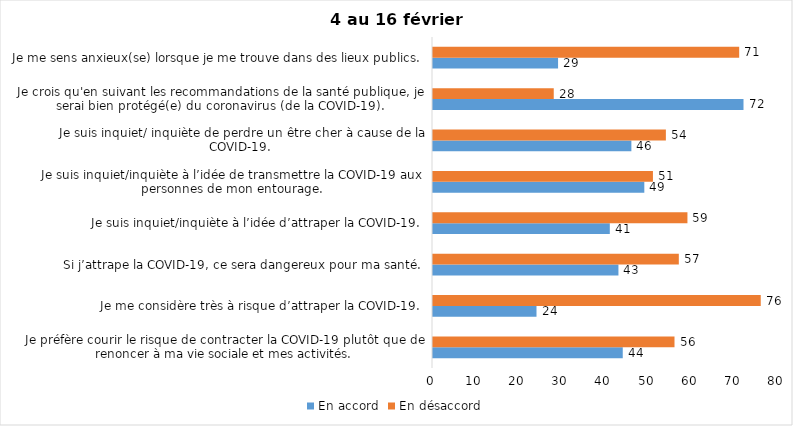
| Category | En accord | En désaccord |
|---|---|---|
| Je préfère courir le risque de contracter la COVID-19 plutôt que de renoncer à ma vie sociale et mes activités. | 44 | 56 |
| Je me considère très à risque d’attraper la COVID-19. | 24 | 76 |
| Si j’attrape la COVID-19, ce sera dangereux pour ma santé. | 43 | 57 |
| Je suis inquiet/inquiète à l’idée d’attraper la COVID-19. | 41 | 59 |
| Je suis inquiet/inquiète à l’idée de transmettre la COVID-19 aux personnes de mon entourage. | 49 | 51 |
| Je suis inquiet/ inquiète de perdre un être cher à cause de la COVID-19. | 46 | 54 |
| Je crois qu'en suivant les recommandations de la santé publique, je serai bien protégé(e) du coronavirus (de la COVID-19). | 72 | 28 |
| Je me sens anxieux(se) lorsque je me trouve dans des lieux publics. | 29 | 71 |